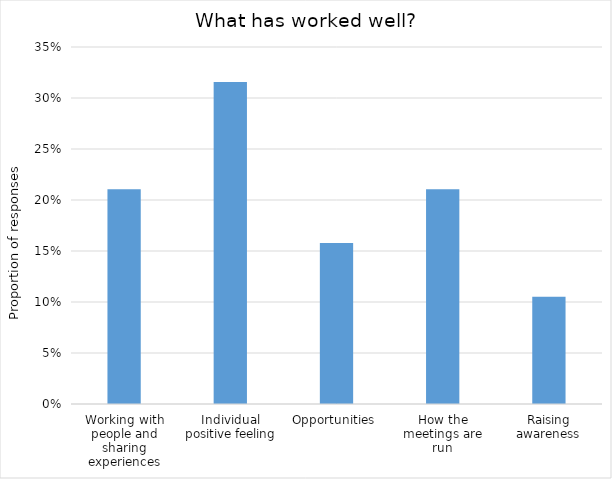
| Category | Proportion |
|---|---|
| Working with people and sharing experiences | 0.211 |
| Individual positive feeling
 | 0.316 |
| Opportunities  | 0.158 |
| How the meetings are run

 | 0.211 |
| Raising awareness | 0.105 |